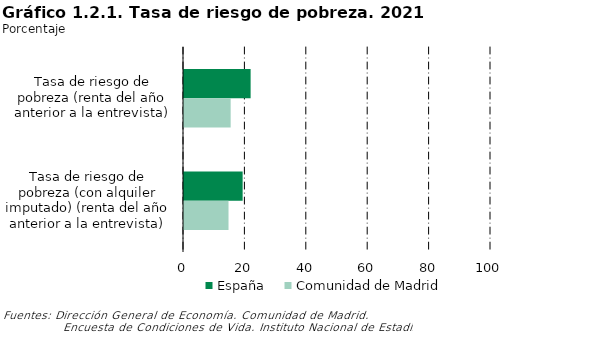
| Category | España | Comunidad de Madrid |
|---|---|---|
| Tasa de riesgo de pobreza (renta del año anterior a la entrevista) | 21.7 | 15.2 |
| Tasa de riesgo de pobreza (con alquiler imputado) (renta del año anterior a la entrevista) | 19.1 | 14.5 |